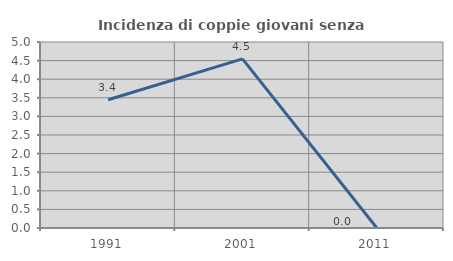
| Category | Incidenza di coppie giovani senza figli |
|---|---|
| 1991.0 | 3.448 |
| 2001.0 | 4.545 |
| 2011.0 | 0 |